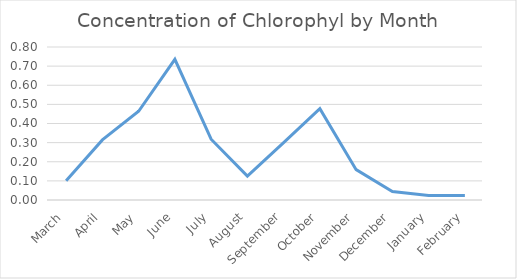
| Category | Series 0 |
|---|---|
| March | 0.101 |
| April | 0.314 |
| May | 0.464 |
| June | 0.735 |
| July | 0.318 |
| August | 0.125 |
| September | 0.3 |
| October | 0.478 |
| November | 0.159 |
| December | 0.044 |
| January | 0.024 |
| February | 0.023 |